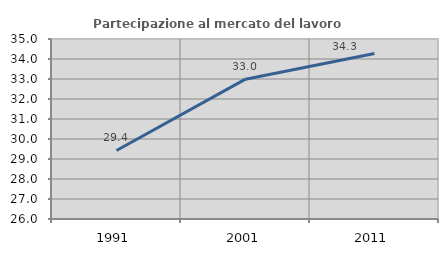
| Category | Partecipazione al mercato del lavoro  femminile |
|---|---|
| 1991.0 | 29.427 |
| 2001.0 | 32.991 |
| 2011.0 | 34.276 |